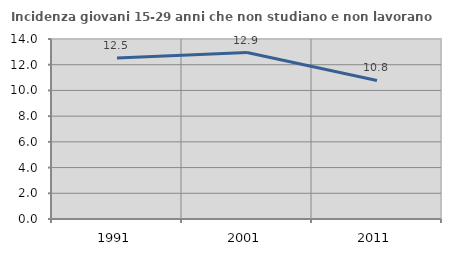
| Category | Incidenza giovani 15-29 anni che non studiano e non lavorano  |
|---|---|
| 1991.0 | 12.525 |
| 2001.0 | 12.95 |
| 2011.0 | 10.778 |